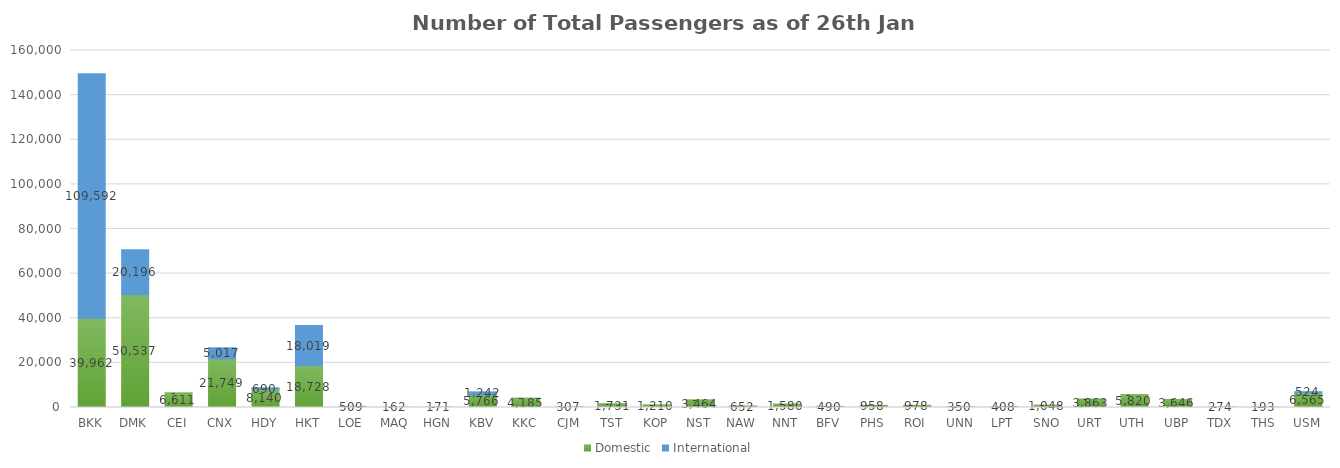
| Category | Domestic | International |
|---|---|---|
| BKK | 39962 | 109592 |
| DMK | 50537 | 20196 |
| CEI | 6611 | 0 |
| CNX | 21749 | 5017 |
| HDY | 8140 | 690 |
| HKT | 18728 | 18019 |
| LOE | 509 | 0 |
| MAQ | 162 | 0 |
| HGN | 171 | 0 |
| KBV | 5766 | 1242 |
| KKC | 4185 | 0 |
| CJM | 307 | 0 |
| TST | 1731 | 0 |
| KOP | 1210 | 0 |
| NST | 3464 | 0 |
| NAW | 652 | 0 |
| NNT | 1580 | 0 |
| BFV | 490 | 0 |
| PHS | 958 | 0 |
| ROI | 978 | 0 |
| UNN | 350 | 0 |
| LPT | 408 | 0 |
| SNO | 1048 | 0 |
| URT | 3863 | 0 |
| UTH | 5820 | 0 |
| UBP | 3646 | 0 |
| TDX | 274 | 0 |
| THS | 193 | 0 |
| USM | 6565 | 524 |